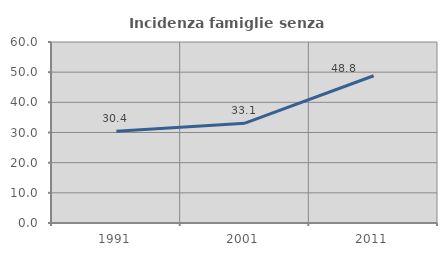
| Category | Incidenza famiglie senza nuclei |
|---|---|
| 1991.0 | 30.423 |
| 2001.0 | 33.079 |
| 2011.0 | 48.815 |